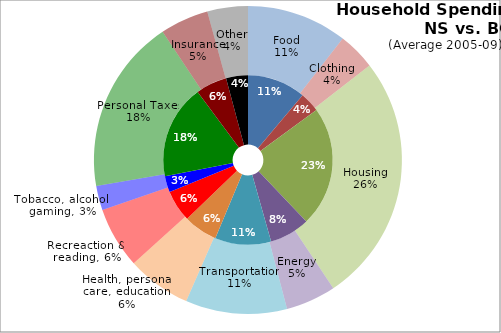
| Category | NS | BC |
|---|---|---|
| Food | 6520.4 | 7551.4 |
| Clothing | 2232.2 | 2810 |
| Housing | 13410.6 | 18743.8 |
| Energy | 4495.4 | 3765.2 |
| Transportation | 6259.2 | 7624.8 |
| Health, personal care, education | 3785.2 | 4824.2 |
| Recreaction & reading | 3526 | 4593.6 |
| Tobacco, alcohol, gaming | 1812.2 | 1834.8 |
| Personal Taxes | 10497 | 13137.4 |
| Insurance | 3483.6 | 3644.8 |
| Other | 2438.4 | 3051.6 |